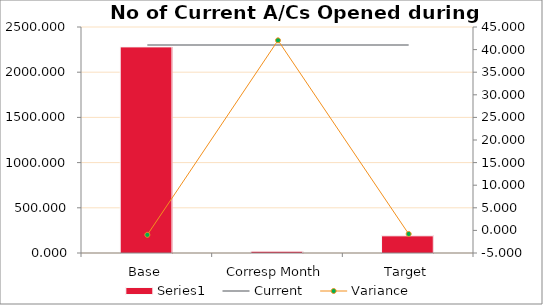
| Category | Series 0 |
|---|---|
| Base | 2280 |
| Corresp Month | 20 |
| Target | 190 |